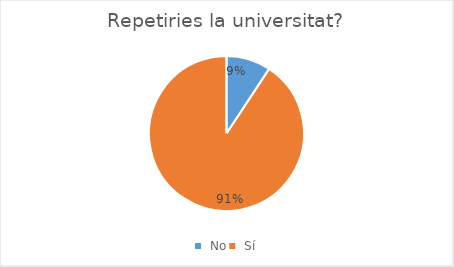
| Category | Series 0 |
|---|---|
|  No | 9 |
|  Sí | 88 |